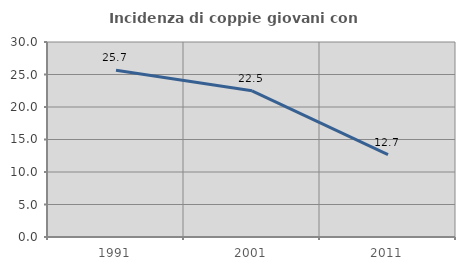
| Category | Incidenza di coppie giovani con figli |
|---|---|
| 1991.0 | 25.664 |
| 2001.0 | 22.491 |
| 2011.0 | 12.658 |